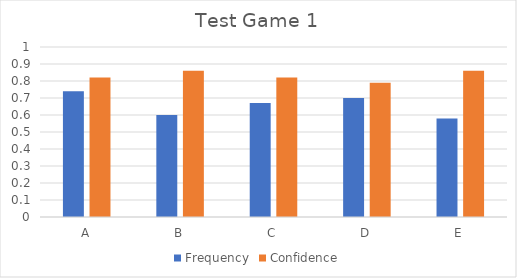
| Category | Frequency | Confidence |
|---|---|---|
| A | 0.74 | 0.82 |
| B | 0.6 | 0.86 |
| C | 0.67 | 0.82 |
| D | 0.7 | 0.79 |
| E | 0.58 | 0.86 |